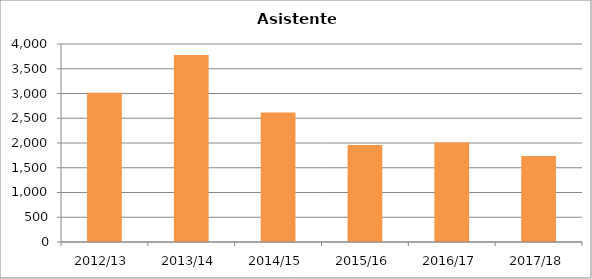
| Category | Asistentes |
|---|---|
| 2012/13 | 3014 |
| 2013/14 | 3780 |
| 2014/15 | 2615 |
| 2015/16 | 1961 |
| 2016/17 | 2008 |
| 2017/18 | 1738 |